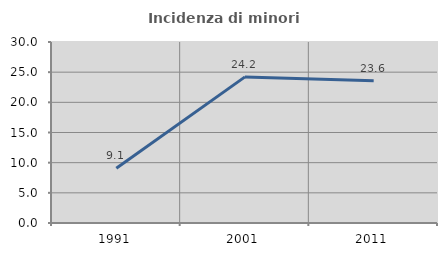
| Category | Incidenza di minori stranieri |
|---|---|
| 1991.0 | 9.091 |
| 2001.0 | 24.217 |
| 2011.0 | 23.585 |